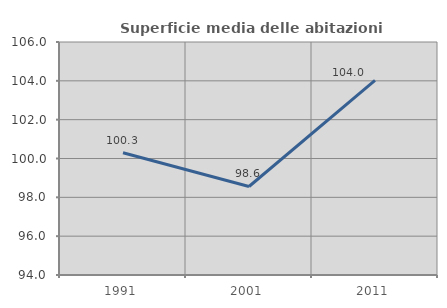
| Category | Superficie media delle abitazioni occupate |
|---|---|
| 1991.0 | 100.296 |
| 2001.0 | 98.558 |
| 2011.0 | 104.021 |